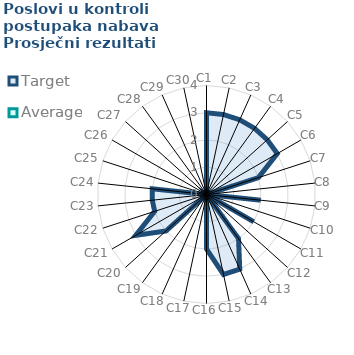
| Category | Target | Average |
|---|---|---|
| C1 | 3 | 0 |
| C2 | 3 | 0 |
| C3 | 3 | 0 |
| C4 | 3 | 0 |
| C5 | 3 | 0 |
| C6 | 3 | 0 |
| C7 | 2 | 0 |
| C8 | 0 | 0 |
| C9 | 2 | 0 |
| C10 | 0 | 0 |
| C11 | 2 | 0 |
| C12 | 0 | 0 |
| C13 | 2 | 0 |
| C14 | 3 | 0 |
| C15 | 3 | 0 |
| C16 | 2 | 0 |
| C17 | 0 | 0 |
| C18 | 0 | 0 |
| C19 | 0 | 0 |
| C20 | 2 | 0 |
| C21 | 3 | 0 |
| C22 | 2 | 0 |
| C23 | 2 | 0 |
| C24 | 2 | 0 |
| C25 | 0 | 0 |
| C26 | 0 | 0 |
| C27 | 0 | 0 |
| C28 | 0 | 0 |
| C29 | 0 | 0 |
| C30 | 0 | 0 |